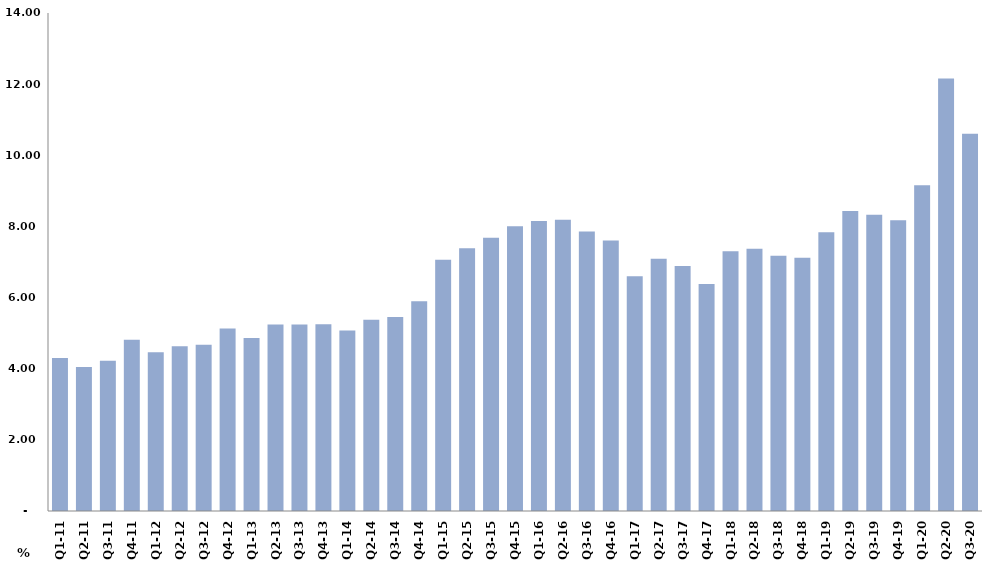
| Category | #REF! |
|---|---|
| Q1-11 | 4.302 |
| Q2-11 | 4.047 |
| Q3-11 | 4.224 |
| Q4-11 | 4.817 |
| Q1-12 | 4.462 |
| Q2-12 | 4.631 |
| Q3-12 | 4.675 |
| Q4-12 | 5.131 |
| Q1-13 | 4.865 |
| Q2-13 | 5.244 |
| Q3-13 | 5.245 |
| Q4-13 | 5.248 |
| Q1-14 | 5.074 |
| Q2-14 | 5.374 |
| Q3-14 | 5.452 |
| Q4-14 | 5.898 |
| Q1-15 | 7.06 |
| Q2-15 | 7.386 |
| Q3-15 | 7.682 |
| Q4-15 | 8.003 |
| Q1-16 | 8.153 |
| Q2-16 | 8.184 |
| Q3-16 | 7.86 |
| Q4-16 | 7.604 |
| Q1-17 | 6.6 |
| Q2-17 | 7.089 |
| Q3-17 | 6.884 |
| Q4-17 | 6.383 |
| Q1-18 | 7.306 |
| Q2-18 | 7.371 |
| Q3-18 | 7.173 |
| Q4-18 | 7.121 |
| Q1-19 | 7.835 |
| Q2-19 | 8.437 |
| Q3-19 | 8.328 |
| Q4-19 | 8.171 |
| Q1-20 | 9.157 |
| Q2-20 | 12.155 |
| Q3-20 | 10.603 |